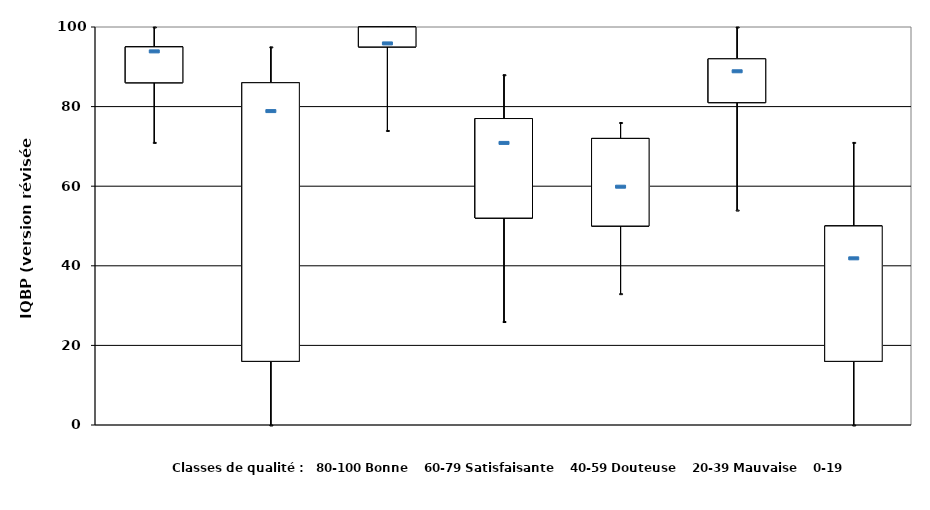
| Category | I_Q1 | I_MIN | I_MAX | I_Q3 |
|---|---|---|---|---|
| CF | 86 | 71 | 100 | 95 |
| CHLA-A | 16 | 0 | 95 | 86 |
| NH3 | 95 | 74 | 100 | 100 |
| NOX | 52 | 26 | 88 | 77 |
| PTOT | 50 | 33 | 76 | 72 |
| MES | 81 | 54 | 100 | 92 |
| IQBP | 16 | 0 | 71 | 50 |